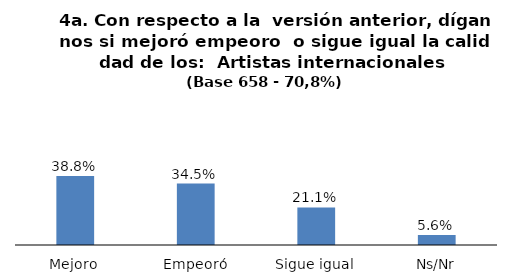
| Category | Series 0 |
|---|---|
| Mejoro | 0.388 |
| Empeoró | 0.345 |
| Sigue igual | 0.211 |
| Ns/Nr | 0.056 |